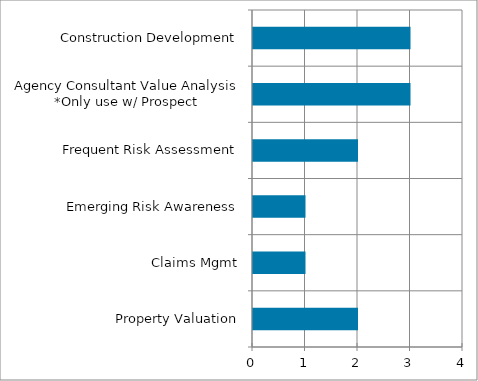
| Category | Series 0 |
|---|---|
| Property Valuation | 2 |
| Claims Mgmt | 1 |
| Emerging Risk Awareness | 1 |
| Frequent Risk Assessment | 2 |
| Agency Consultant Value Analysis *Only use w/ Prospect | 3 |
| Construction Development | 3 |